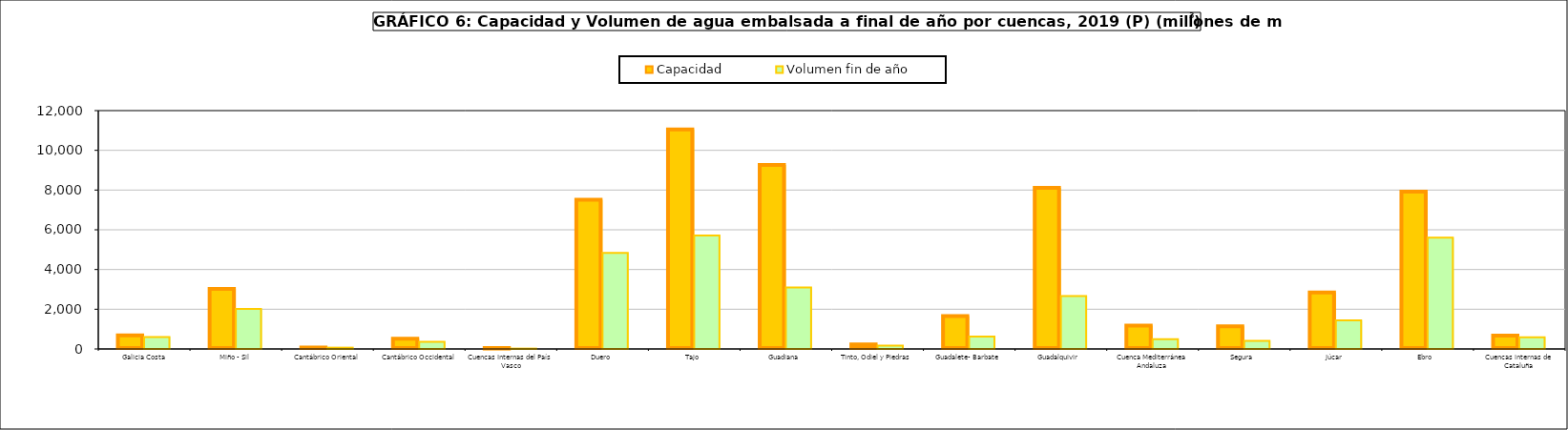
| Category | Capacidad | Volumen fin de año |
|---|---|---|
| Galicia Costa | 684 | 605 |
| Miño - Sil | 3030 | 2012 |
| Cantábrico Oriental | 73 | 66 |
| Cantábrico Occidental | 518 | 364 |
| Cuencas Internas del País Vasco | 21 | 19 |
| Duero  | 7507 | 4840 |
| Tajo  | 11056 | 5716 |
| Guadiana  | 9261 | 3094 |
| Tinto, Odiel y Piedras | 229 | 172 |
| Guadalete- Barbate | 1651 | 623 |
| Guadalquivir  | 8113 | 2661 |
| Cuenca Mediterránea Andaluza | 1174 | 490 |
| Segura  | 1140 | 405 |
| Júcar  | 2846 | 1439 |
| Ebro  | 7919 | 5603 |
| Cuencas internas de Cataluña | 677 | 583 |